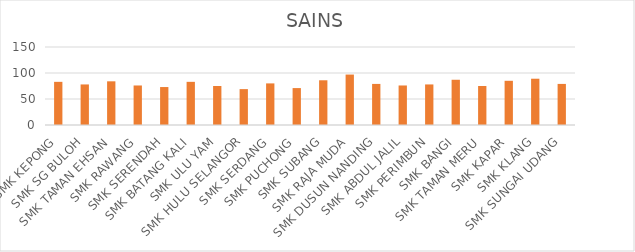
| Category | SAINS |
|---|---|
| SMK KEPONG | 83 |
| SMK SG BULOH | 78 |
| SMK TAMAN EHSAN | 84 |
| SMK RAWANG | 76 |
| SMK SERENDAH | 73 |
| SMK BATANG KALI | 83 |
| SMK ULU YAM | 75 |
| SMK HULU SELANGOR | 69 |
| SMK SERDANG | 80 |
| SMK PUCHONG | 71 |
| SMK SUBANG | 86 |
| SMK RAJA MUDA | 97 |
| SMK DUSUN NANDING | 79 |
| SMK ABDUL JALIL | 76 |
| SMK PERIMBUN | 78 |
| SMK BANGI | 87 |
| SMK TAMAN MERU | 75 |
| SMK KAPAR | 85 |
| SMK KLANG | 89 |
| SMK SUNGAI UDANG | 79 |